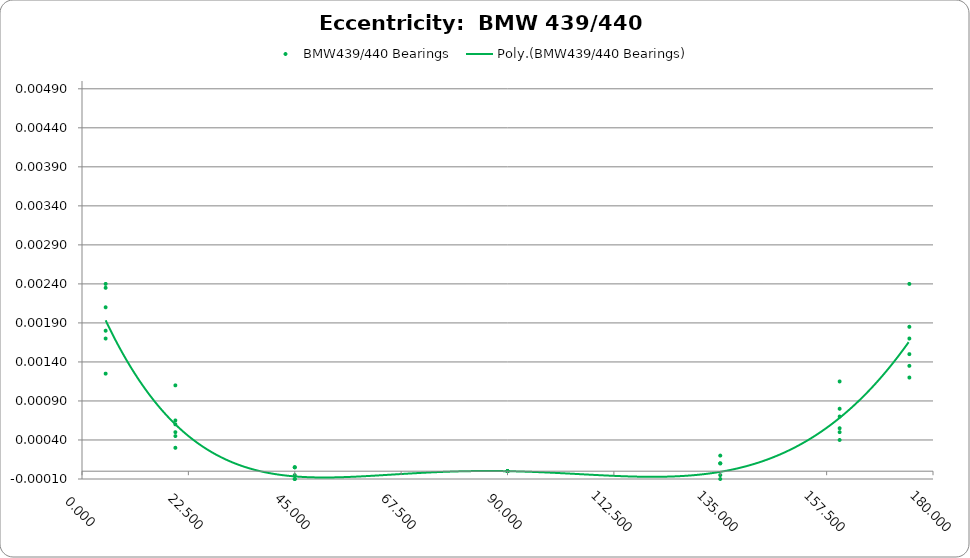
| Category | BMW439/440 Bearings |
|---|---|
| 5.0 | 0.001 |
| 5.0 | 0.002 |
| 5.0 | 0.002 |
| 5.0 | 0.002 |
| 5.0 | 0.002 |
| 5.0 | 0.002 |
| 19.75 | 0 |
| 19.75 | 0.001 |
| 19.75 | 0.001 |
| 19.75 | 0.001 |
| 19.75 | 0 |
| 19.75 | 0 |
| 45.0 | 0 |
| 45.0 | 0 |
| 45.0 | 0 |
| 45.0 | 0 |
| 45.0 | 0 |
| 45.0 | 0 |
| 90.0 | 0 |
| 90.0 | 0 |
| 90.0 | 0 |
| 90.0 | 0 |
| 90.0 | 0 |
| 90.0 | 0 |
| 135.0 | 0 |
| 135.0 | 0 |
| 135.0 | 0 |
| 135.0 | 0 |
| 135.0 | 0 |
| 135.0 | 0 |
| 160.25 | 0.001 |
| 160.25 | 0 |
| 160.25 | 0 |
| 160.25 | 0.001 |
| 160.25 | 0.001 |
| 160.25 | 0.001 |
| 175.0 | 0.002 |
| 175.0 | 0.002 |
| 175.0 | 0.001 |
| 175.0 | 0.002 |
| 175.0 | 0.001 |
| 175.0 | 0.001 |